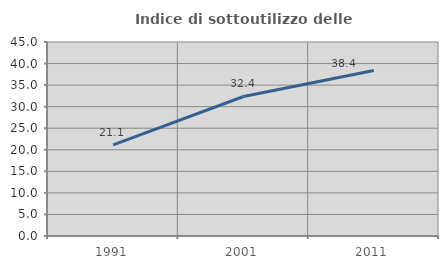
| Category | Indice di sottoutilizzo delle abitazioni  |
|---|---|
| 1991.0 | 21.134 |
| 2001.0 | 32.36 |
| 2011.0 | 38.398 |